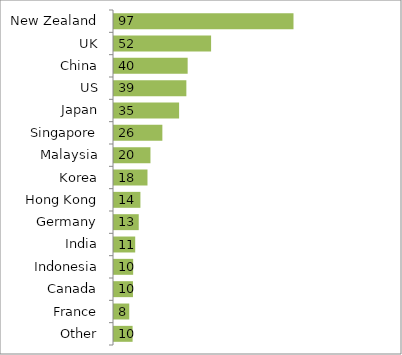
| Category | Series 0 |
|---|---|
| New Zealand | 96.5 |
| UK | 52.2 |
| China | 39.6 |
| US | 38.9 |
| Japan | 35 |
| Singapore | 26 |
| Malaysia | 19.6 |
| Korea | 18 |
| Hong Kong | 14.2 |
| Germany | 13.3 |
| India | 11.4 |
| Indonesia | 10.3 |
| Canada | 10.2 |
| France | 8.2 |
| Other | 10 |